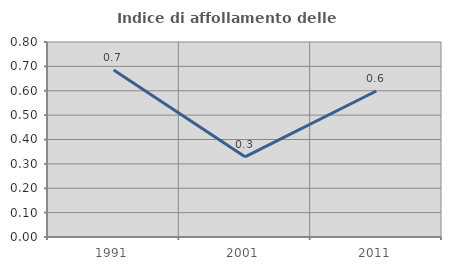
| Category | Indice di affollamento delle abitazioni  |
|---|---|
| 1991.0 | 0.685 |
| 2001.0 | 0.329 |
| 2011.0 | 0.599 |